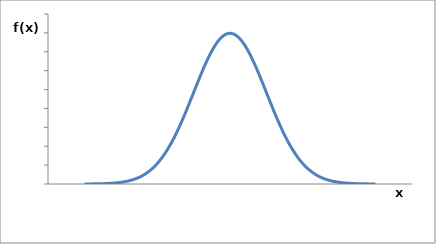
| Category | Series 0 |
|---|---|
| 1.0 | 0 |
| 1.1 | 0 |
| 1.2000000000000002 | 0 |
| 1.2999999999999998 | 0 |
| 1.4 | 0.001 |
| 1.5 | 0.001 |
| 1.6 | 0.001 |
| 1.7000000000000002 | 0.002 |
| 1.7999999999999998 | 0.002 |
| 1.9 | 0.003 |
| 2.0 | 0.004 |
| 2.1 | 0.006 |
| 2.2 | 0.008 |
| 2.3 | 0.01 |
| 2.4000000000000004 | 0.014 |
| 2.5 | 0.018 |
| 2.6 | 0.022 |
| 2.7 | 0.028 |
| 2.8 | 0.035 |
| 2.9000000000000004 | 0.044 |
| 3.0 | 0.054 |
| 3.1 | 0.066 |
| 3.2 | 0.079 |
| 3.3000000000000003 | 0.094 |
| 3.4000000000000004 | 0.111 |
| 3.5 | 0.13 |
| 3.6 | 0.15 |
| 3.7 | 0.171 |
| 3.8000000000000003 | 0.194 |
| 3.9000000000000004 | 0.218 |
| 4.0 | 0.242 |
| 4.1 | 0.266 |
| 4.2 | 0.29 |
| 4.300000000000001 | 0.312 |
| 4.4 | 0.333 |
| 4.5 | 0.352 |
| 4.6 | 0.368 |
| 4.7 | 0.381 |
| 4.800000000000001 | 0.391 |
| 4.9 | 0.397 |
| 5.0 | 0.399 |
| 5.1000000000000005 | 0.397 |
| 5.2 | 0.391 |
| 5.3 | 0.381 |
| 5.4 | 0.368 |
| 5.5 | 0.352 |
| 5.6000000000000005 | 0.333 |
| 5.7 | 0.312 |
| 5.800000000000001 | 0.29 |
| 5.9 | 0.266 |
| 6.0 | 0.242 |
| 6.1000000000000005 | 0.218 |
| 6.2 | 0.194 |
| 6.300000000000001 | 0.171 |
| 6.4 | 0.15 |
| 6.5 | 0.13 |
| 6.6000000000000005 | 0.111 |
| 6.7 | 0.094 |
| 6.800000000000001 | 0.079 |
| 6.9 | 0.066 |
| 7.0 | 0.054 |
| 7.1000000000000005 | 0.044 |
| 7.2 | 0.035 |
| 7.300000000000001 | 0.028 |
| 7.4 | 0.022 |
| 7.5 | 0.018 |
| 7.6000000000000005 | 0.014 |
| 7.7 | 0.01 |
| 7.800000000000001 | 0.008 |
| 7.9 | 0.006 |
| 8.0 | 0.004 |
| 8.100000000000001 | 0.003 |
| 8.2 | 0.002 |
| 8.3 | 0.002 |
| 8.4 | 0.001 |
| 8.5 | 0.001 |
| 8.600000000000001 | 0.001 |
| 8.7 | 0 |
| 8.8 | 0 |
| 8.9 | 0 |
| 9.0 | 0 |